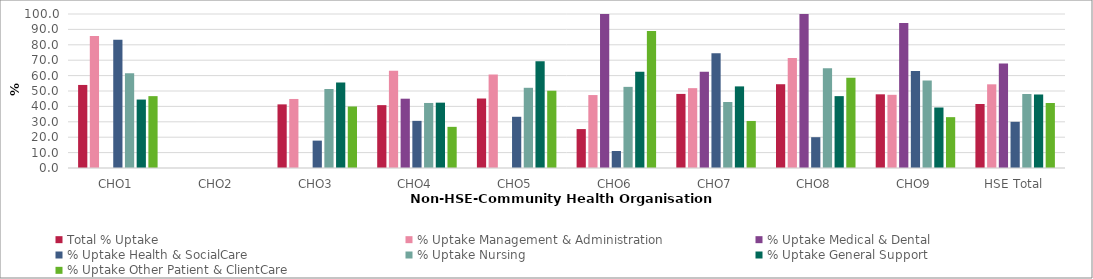
| Category | Total % Uptake | % Uptake Management & Administration | % Uptake Medical & Dental | % Uptake Health & SocialCare | % Uptake Nursing | % Uptake General Support | % Uptake Other Patient & ClientCare |
|---|---|---|---|---|---|---|---|
| CHO1 | 53.933 | 85.714 | 0 | 83.333 | 61.538 | 44.444 | 46.667 |
| CHO2 | 0 | 0 | 0 | 0 | 0 | 0 | 0 |
| CHO3 | 41.321 | 44.828 | 0 | 17.778 | 51.282 | 55.556 | 39.94 |
| CHO4 | 40.818 | 63.095 | 45 | 30.612 | 42.233 | 42.432 | 26.724 |
| CHO5 | 45.123 | 60.714 | 0 | 33.26 | 52.083 | 69.318 | 50.183 |
| CHO6 | 25.273 | 47.368 | 100 | 11.023 | 52.688 | 62.5 | 88.889 |
| CHO7 | 48.105 | 51.852 | 62.5 | 74.519 | 42.857 | 52.991 | 30.547 |
| CHO8 | 54.4 | 71.429 | 100 | 20 | 64.706 | 46.667 | 58.571 |
| CHO9 | 47.848 | 47.525 | 94.118 | 62.931 | 56.863 | 39.286 | 33.019 |
| HSE Total | 41.577 | 54.342 | 67.857 | 29.989 | 48.048 | 47.736 | 42.221 |